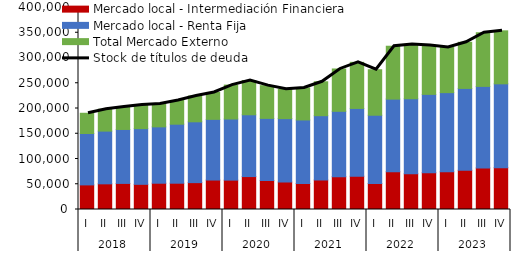
| Category | Mercado local - Intermediación Financiera | Mercado local - Renta Fija | Total Mercado Externo |
|---|---|---|---|
| 0 | 48718.222 | 101732.303 | 40105.384 |
| 1 | 50821.43 | 104405.508 | 43340.068 |
| 2 | 51659.727 | 106847.496 | 44354.727 |
| 3 | 49856.484 | 110255.556 | 46687.209 |
| 4 | 52044.71 | 111590.197 | 45192.802 |
| 5 | 52068.512 | 116850.941 | 46955.176 |
| 6 | 53207.47 | 120424.904 | 51032.848 |
| 7 | 58338.263 | 120167.795 | 53267.565 |
| 8 | 58162.886 | 121052.994 | 67094.761 |
| 9 | 65219.047 | 122364.737 | 67880.928 |
| 10 | 57329.529 | 123107.948 | 64798.957 |
| 11 | 54291.801 | 125662.198 | 58077.352 |
| 12 | 51620.44 | 125695.92 | 63462.882 |
| 13 | 58403.598 | 127364.993 | 67145.937 |
| 14 | 65027.738 | 129406.998 | 83855.035 |
| 15 | 65942.903 | 134186.006 | 91284.917 |
| 16 | 51563.463 | 135103.126 | 90096.036 |
| 17 | 74772.933 | 143826.713 | 104703.851 |
| 18 | 70654.46 | 148666.096 | 107606.167 |
| 19 | 72847.51 | 155122.511 | 96978.32 |
| 20 | 74595.113 | 156826.673 | 89368.481 |
| 21 | 77588.15 | 162182.022 | 91335.368 |
| 22 | 82314.913 | 161465.052 | 106251.742 |
| 23 | 82869.55 | 165961.107 | 104948.618 |